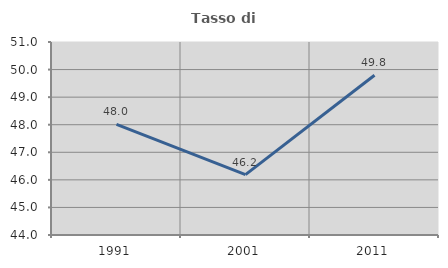
| Category | Tasso di occupazione   |
|---|---|
| 1991.0 | 48.012 |
| 2001.0 | 46.19 |
| 2011.0 | 49.792 |